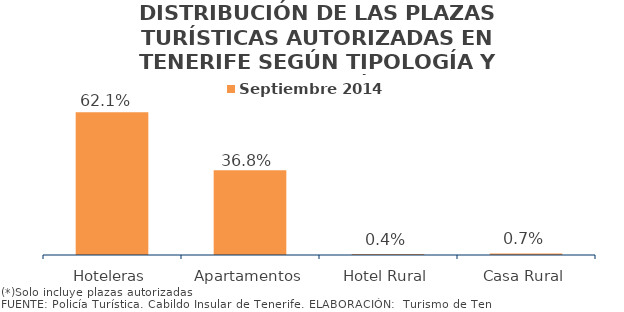
| Category | Septiembre 2014 |
|---|---|
| Hoteleras | 0.621 |
| Apartamentos | 0.368 |
| Hotel Rural | 0.004 |
| Casa Rural | 0.007 |